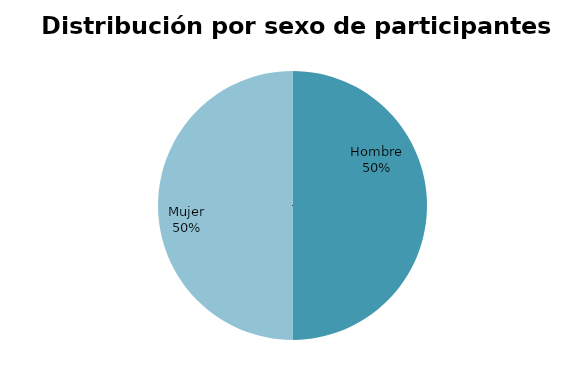
| Category | Series 0 |
|---|---|
| Hombre | 5 |
| Mujer | 5 |